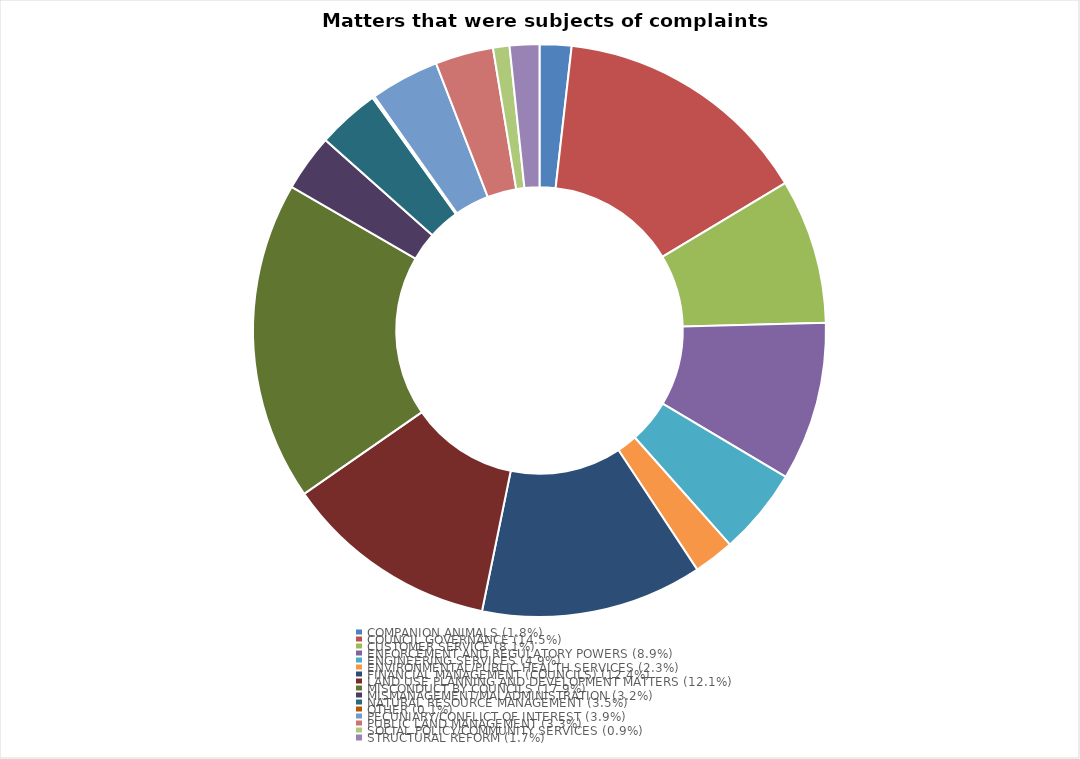
| Category | Total |
|---|---|
| COMPANION ANIMALS (1.8%) | 0.018 |
| COUNCIL GOVERNANCE (14.5%) | 0.145 |
| CUSTOMER SERVICE (8.1%) | 0.081 |
| ENFORCEMENT AND REGULATORY POWERS (8.9%) | 0.089 |
| ENGINEERING SERVICES (4.9%) | 0.049 |
| ENVIRONMENTAL/PUBLIC HEALTH SERVICES (2.3%) | 0.023 |
| FINANCIAL MANAGEMENT (COUNCILS) (12.4%) | 0.124 |
| LAND USE PLANNING AND DEVELOPMENT MATTERS (12.1%) | 0.121 |
| MISCONDUCT BY COUNCILS (17.9%) | 0.179 |
| MISMANAGEMENT/MALADMINISTRATION (3.2%) | 0.032 |
| NATURAL RESOURCE MANAGEMENT (3.5%) | 0.035 |
| OTHER (0.1%) | 0.001 |
| PECUNIARY/CONFLICT OF INTEREST (3.9%) | 0.039 |
| PUBLIC LAND MANAGEMENT (3.3%) | 0.033 |
| SOCIAL POLICY/COMMUNITY SERVICES (0.9%) | 0.009 |
| STRUCTURAL REFORM (1.7%) | 0.017 |